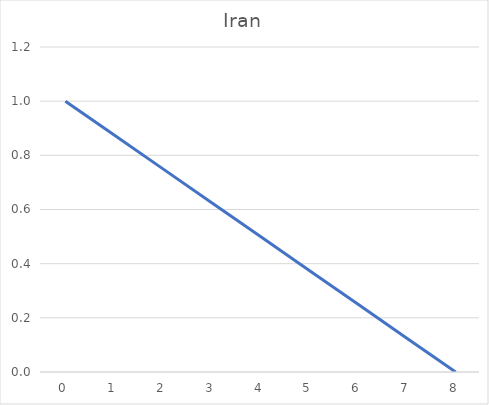
| Category | Portugal |
|---|---|
| 0.0 | 1 |
| 1.0 | 0.875 |
| 2.0 | 0.75 |
| 3.0 | 0.625 |
| 4.0 | 0.5 |
| 5.0 | 0.375 |
| 6.0 | 0.25 |
| 7.0 | 0.125 |
| 8.0 | 0 |